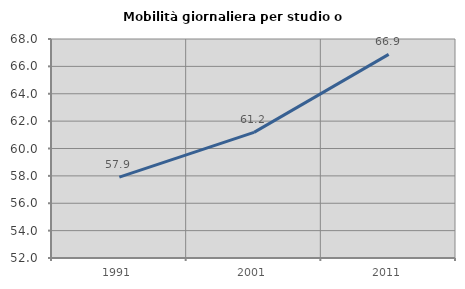
| Category | Mobilità giornaliera per studio o lavoro |
|---|---|
| 1991.0 | 57.903 |
| 2001.0 | 61.176 |
| 2011.0 | 66.873 |